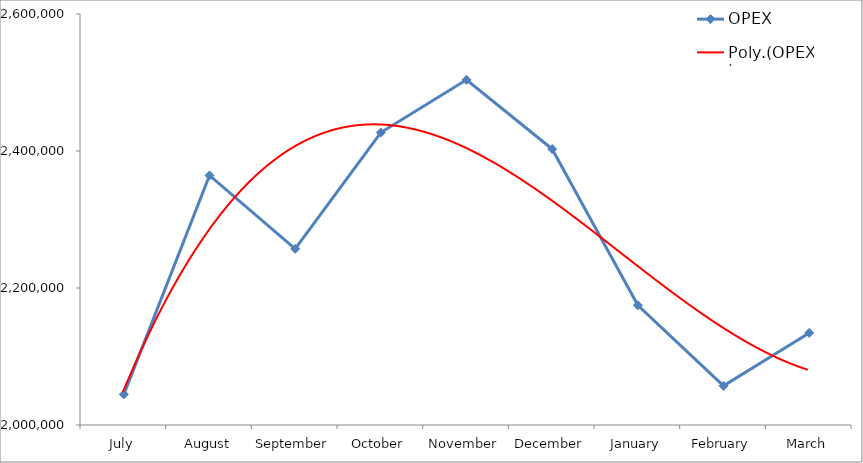
| Category | OPEX |
|---|---|
| July | 2044723 |
| August | 2364293 |
| September | 2257099 |
| October | 2426917 |
| November | 2503962 |
| December | 2402855 |
| January | 2174774 |
| February | 2057145 |
| March | 2134450 |